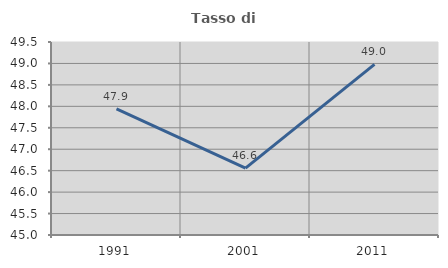
| Category | Tasso di occupazione   |
|---|---|
| 1991.0 | 47.941 |
| 2001.0 | 46.558 |
| 2011.0 | 48.98 |